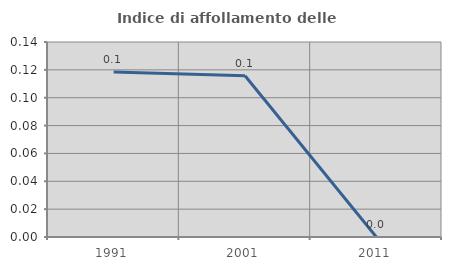
| Category | Indice di affollamento delle abitazioni  |
|---|---|
| 1991.0 | 0.118 |
| 2001.0 | 0.116 |
| 2011.0 | 0 |